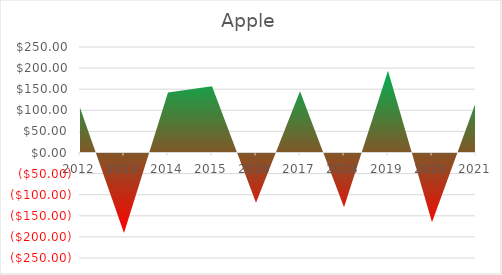
| Category | Apple |
|---|---|
| 2012.0 | 106 |
| 2013.0 | -191 |
| 2014.0 | 142 |
| 2015.0 | 157 |
| 2016.0 | -119 |
| 2017.0 | 145 |
| 2018.0 | -130 |
| 2019.0 | 194 |
| 2020.0 | -165 |
| 2021.0 | 120 |